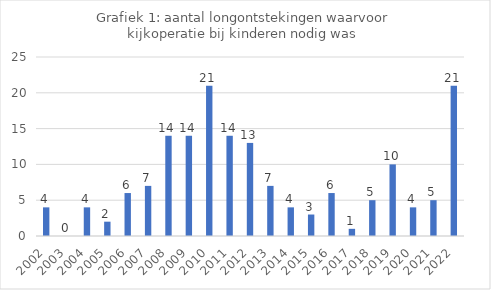
| Category | Aantal longontstekingen met kijkoperatie bij kinderen |
|---|---|
| 2002.0 | 4 |
| 2003.0 | 0 |
| 2004.0 | 4 |
| 2005.0 | 2 |
| 2006.0 | 6 |
| 2007.0 | 7 |
| 2008.0 | 14 |
| 2009.0 | 14 |
| 2010.0 | 21 |
| 2011.0 | 14 |
| 2012.0 | 13 |
| 2013.0 | 7 |
| 2014.0 | 4 |
| 2015.0 | 3 |
| 2016.0 | 6 |
| 2017.0 | 1 |
| 2018.0 | 5 |
| 2019.0 | 10 |
| 2020.0 | 4 |
| 2021.0 | 5 |
| 2022.0 | 21 |